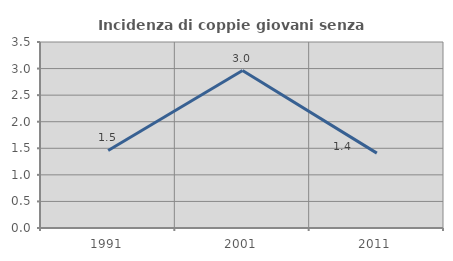
| Category | Incidenza di coppie giovani senza figli |
|---|---|
| 1991.0 | 1.46 |
| 2001.0 | 2.963 |
| 2011.0 | 1.408 |